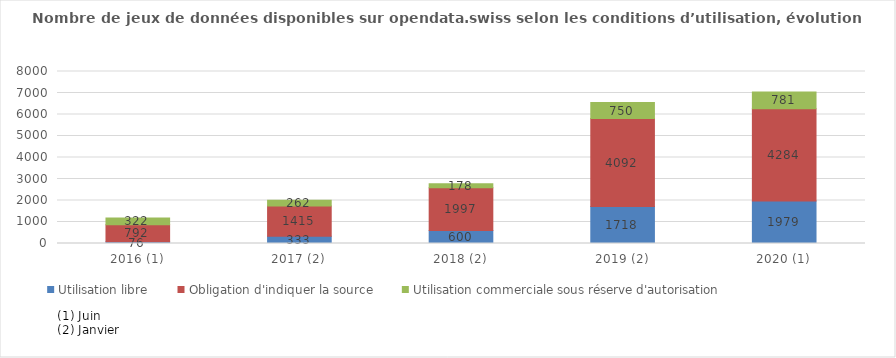
| Category | Utilisation libre | Obligation d'indiquer la source | Utilisation commerciale sous réserve d'autorisation |
|---|---|---|---|
| 2016 (1) | 76 | 792 | 322 |
| 2017 (2) | 333 | 1415 | 262 |
| 2018 (2) | 600 | 1997 | 178 |
| 2019 (2) | 1718 | 4092 | 750 |
| 2020 (1) | 1979 | 4284 | 781 |